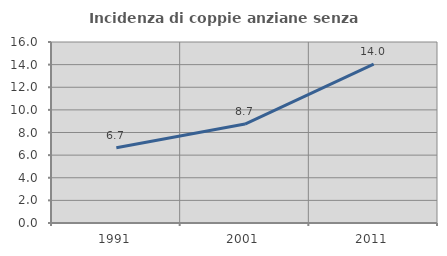
| Category | Incidenza di coppie anziane senza figli  |
|---|---|
| 1991.0 | 6.653 |
| 2001.0 | 8.746 |
| 2011.0 | 14.046 |